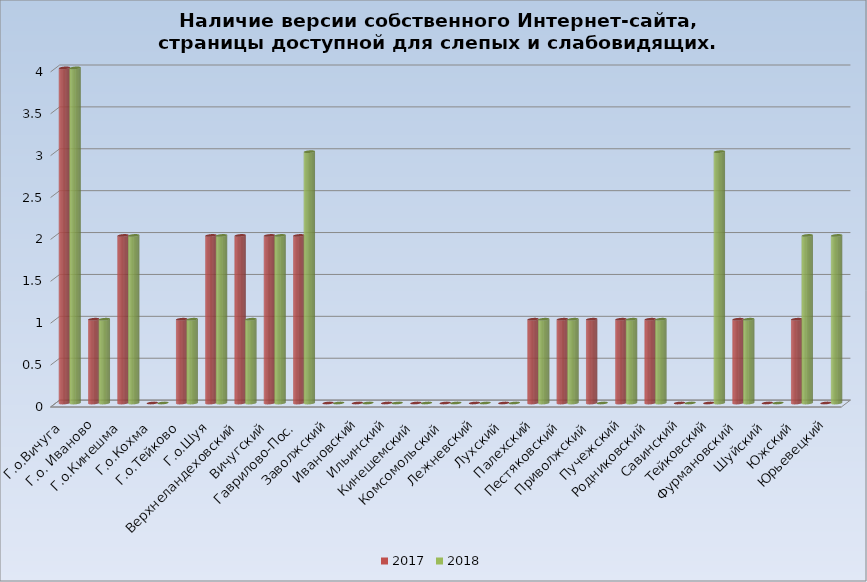
| Category | 2017 | 2018 |
|---|---|---|
| Г.о.Вичуга | 4 | 4 |
| Г.о. Иваново | 1 | 1 |
| Г.о.Кинешма | 2 | 2 |
| Г.о.Кохма | 0 | 0 |
| Г.о.Тейково | 1 | 1 |
| Г.о.Шуя | 2 | 2 |
| Верхнеландеховский | 2 | 1 |
| Вичугский | 2 | 2 |
| Гаврилово-Пос. | 2 | 3 |
| Заволжский | 0 | 0 |
| Ивановский | 0 | 0 |
| Ильинский | 0 | 0 |
| Кинешемский | 0 | 0 |
| Комсомольский | 0 | 0 |
| Лежневский | 0 | 0 |
| Лухский | 0 | 0 |
| Палехский | 1 | 1 |
| Пестяковский | 1 | 1 |
| Приволжский | 1 | 0 |
| Пучежский | 1 | 1 |
| Родниковский | 1 | 1 |
| Савинский | 0 | 0 |
| Тейковский | 0 | 3 |
| Фурмановский | 1 | 1 |
| Шуйский | 0 | 0 |
| Южский | 1 | 2 |
| Юрьевецкий | 0 | 2 |